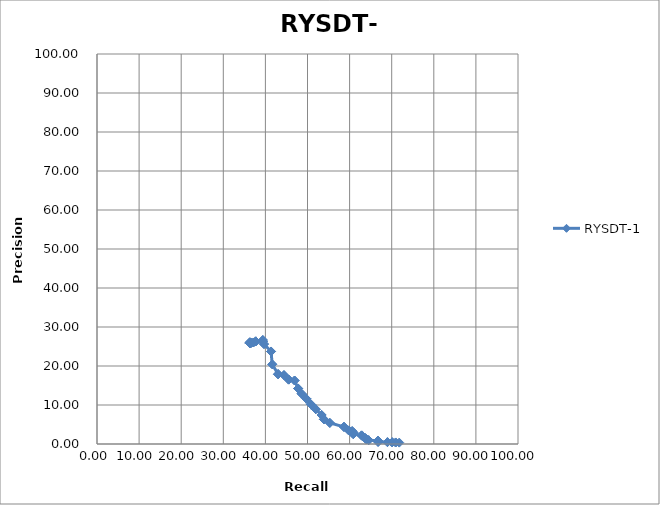
| Category | RYSDT-1 |
|---|---|
| 36.313 | 26.052 |
| 36.313 | 26.052 |
| 36.313 | 26.052 |
| 36.313 | 26.052 |
| 36.313 | 26.052 |
| 36.313 | 25.845 |
| 36.313 | 25.845 |
| 36.313 | 25.845 |
| 36.313 | 25.845 |
| 36.313 | 25.845 |
| 36.592 | 25.941 |
| 36.592 | 25.941 |
| 36.592 | 25.941 |
| 37.151 | 26.027 |
| 37.151 | 26.027 |
| 37.709 | 26.316 |
| 37.709 | 26.316 |
| 37.709 | 26.316 |
| 39.385 | 26.654 |
| 39.385 | 26.654 |
| 39.385 | 26.306 |
| 39.385 | 26.306 |
| 39.385 | 26.306 |
| 39.665 | 25.632 |
| 39.665 | 25.632 |
| 41.341 | 23.718 |
| 41.341 | 23.718 |
| 41.341 | 23.718 |
| 41.62 | 20.439 |
| 41.62 | 20.439 |
| 43.017 | 17.907 |
| 43.017 | 17.907 |
| 43.017 | 17.907 |
| 44.413 | 17.667 |
| 44.413 | 17.667 |
| 45.531 | 16.515 |
| 45.531 | 16.515 |
| 45.531 | 16.515 |
| 46.927 | 16.279 |
| 46.927 | 16.279 |
| 47.765 | 14.238 |
| 47.765 | 14.238 |
| 47.765 | 14.238 |
| 48.603 | 12.889 |
| 48.603 | 12.889 |
| 49.721 | 11.596 |
| 49.721 | 11.596 |
| 49.721 | 11.596 |
| 50.838 | 10.156 |
| 50.838 | 10.156 |
| 51.955 | 8.934 |
| 51.955 | 8.934 |
| 51.955 | 8.934 |
| 53.352 | 7.438 |
| 53.352 | 7.438 |
| 53.911 | 6.315 |
| 53.911 | 6.315 |
| 53.911 | 6.315 |
| 55.307 | 5.41 |
| 55.307 | 5.41 |
| 58.659 | 4.393 |
| 58.659 | 4.393 |
| 58.659 | 4.393 |
| 59.777 | 3.487 |
| 59.777 | 3.487 |
| 60.615 | 3.275 |
| 60.615 | 3.275 |
| 60.615 | 3.275 |
| 60.894 | 2.936 |
| 60.894 | 2.936 |
| 60.894 | 2.528 |
| 60.894 | 2.528 |
| 60.894 | 2.528 |
| 62.849 | 2.209 |
| 62.849 | 2.209 |
| 63.128 | 1.941 |
| 63.128 | 1.941 |
| 63.128 | 1.941 |
| 63.687 | 1.522 |
| 63.687 | 1.522 |
| 63.966 | 1.228 |
| 63.966 | 1.228 |
| 63.966 | 1.228 |
| 64.525 | 0.988 |
| 64.525 | 0.988 |
| 66.76 | 0.839 |
| 66.76 | 0.839 |
| 66.76 | 0.839 |
| 66.76 | 0.702 |
| 66.76 | 0.702 |
| 66.76 | 0.565 |
| 66.76 | 0.565 |
| 66.76 | 0.565 |
| 68.994 | 0.473 |
| 68.994 | 0.473 |
| 70.112 | 0.432 |
| 70.112 | 0.432 |
| 70.112 | 0.432 |
| 70.95 | 0.389 |
| 70.95 | 0.389 |
| 71.788 | 0.353 |